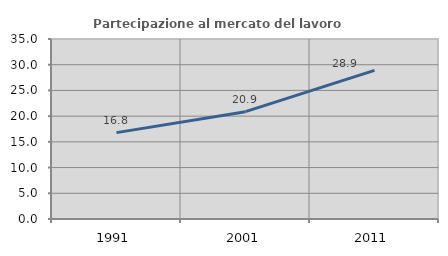
| Category | Partecipazione al mercato del lavoro  femminile |
|---|---|
| 1991.0 | 16.794 |
| 2001.0 | 20.872 |
| 2011.0 | 28.906 |